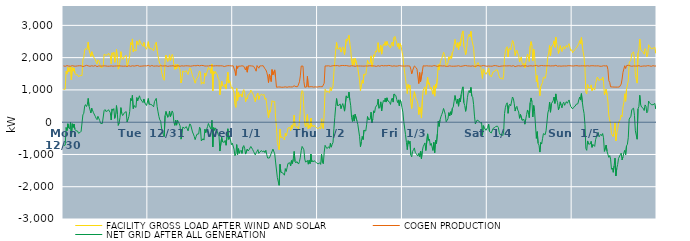
| Category | FACILITY GROSS LOAD AFTER WIND AND SOLAR | COGEN PRODUCTION | NET GRID AFTER ALL GENERATION |
|---|---|---|---|
|  Mon  12/30 | 1017 | 1745 | -728 |
|  Mon  12/30 | 1010 | 1744 | -734 |
|  Mon  12/30 | 1022 | 1731 | -709 |
|  Mon  12/30 | 1578 | 1745 | -167 |
|  Mon  12/30 | 1491 | 1753 | -262 |
|  Mon  12/30 | 1694 | 1743 | -49 |
|  Mon  12/30 | 1563 | 1738 | -175 |
|  Mon  12/30 | 1541 | 1749 | -208 |
|  Mon  12/30 | 1733 | 1734 | -1 |
|  Mon  12/30 | 1307 | 1746 | -439 |
|  Mon  12/30 | 1703 | 1751 | -48 |
|  Mon  12/30 | 1582 | 1745 | -163 |
|  Mon  12/30 | 1681 | 1737 | -56 |
|  Mon  12/30 | 1521 | 1743 | -222 |
|  Mon  12/30 | 1472 | 1736 | -264 |
|  Mon  12/30 | 1482 | 1726 | -244 |
|  Mon  12/30 | 1469 | 1744 | -275 |
|  Mon  12/30 | 1414 | 1756 | -342 |
|  Mon  12/30 | 1415 | 1749 | -334 |
|  Mon  12/30 | 1444 | 1758 | -314 |
|  Mon  12/30 | 1466 | 1748 | -282 |
|  Mon  12/30 | 1446 | 1740 | -294 |
|  Mon  12/30 | 1948 | 1723 | 225 |
|  Mon  12/30 | 2003 | 1727 | 276 |
|  Mon  12/30 | 2238 | 1740 | 498 |
|  Mon  12/30 | 2282 | 1738 | 544 |
|  Mon  12/30 | 2246 | 1762 | 484 |
|  Mon  12/30 | 2295 | 1756 | 539 |
|  Mon  12/30 | 2481 | 1745 | 736 |
|  Mon  12/30 | 2234 | 1740 | 494 |
|  Mon  12/30 | 2254 | 1732 | 522 |
|  Mon  12/30 | 2035 | 1748 | 287 |
|  Mon  12/30 | 2183 | 1748 | 435 |
|  Mon  12/30 | 2174 | 1753 | 421 |
|  Mon  12/30 | 2026 | 1735 | 291 |
|  Mon  12/30 | 1996 | 1733 | 263 |
|  Mon  12/30 | 1937 | 1755 | 182 |
|  Mon  12/30 | 1860 | 1740 | 120 |
|  Mon  12/30 | 1799 | 1721 | 78 |
|  Mon  12/30 | 1933 | 1750 | 183 |
|  Mon  12/30 | 1902 | 1744 | 158 |
|  Mon  12/30 | 1816 | 1764 | 52 |
|  Mon  12/30 | 1703 | 1738 | -35 |
|  Mon  12/30 | 1677 | 1732 | -55 |
|  Mon  12/30 | 1699 | 1740 | -41 |
|  Mon  12/30 | 1731 | 1745 | -14 |
|  Mon  12/30 | 2104 | 1745 | 359 |
|  Mon  12/30 | 2131 | 1740 | 391 |
|  Mon  12/30 | 2075 | 1742 | 333 |
|  Mon  12/30 | 2072 | 1755 | 317 |
|  Mon  12/30 | 2084 | 1734 | 350 |
|  Mon  12/30 | 2137 | 1750 | 387 |
|  Mon  12/30 | 2111 | 1735 | 376 |
|  Mon  12/30 | 2050 | 1754 | 296 |
|  Mon  12/30 | 1811 | 1744 | 67 |
|  Mon  12/30 | 2151 | 1740 | 411 |
|  Mon  12/30 | 2099 | 1735 | 364 |
|  Mon  12/30 | 2167 | 1746 | 421 |
|  Mon  12/30 | 1857 | 1740 | 117 |
|  Mon  12/30 | 1969 | 1754 | 215 |
|  Mon  12/30 | 2256 | 1741 | 515 |
|  Mon  12/30 | 1997 | 1745 | 252 |
|  Mon  12/30 | 1644 | 1743 | -99 |
|  Mon  12/30 | 1717 | 1741 | -24 |
|  Mon  12/30 | 1888 | 1744 | 144 |
|  Mon  12/30 | 2185 | 1734 | 451 |
|  Mon  12/30 | 2007 | 1738 | 269 |
|  Mon  12/30 | 1948 | 1743 | 205 |
|  Mon  12/30 | 1943 | 1735 | 208 |
|  Mon  12/30 | 2030 | 1736 | 294 |
|  Mon  12/30 | 2027 | 1740 | 287 |
|  Mon  12/30 | 2069 | 1742 | 327 |
|  Mon  12/30 | 1733 | 1727 | 6 |
|  Mon  12/30 | 1825 | 1736 | 89 |
|  Mon  12/30 | 1926 | 1750 | 176 |
|  Mon  12/30 | 2067 | 1730 | 337 |
|  Mon  12/30 | 2465 | 1731 | 734 |
|  Mon  12/30 | 2402 | 1729 | 673 |
|  Mon  12/30 | 2581 | 1748 | 833 |
|  Mon  12/30 | 2177 | 1755 | 422 |
|  Mon  12/30 | 2247 | 1737 | 510 |
|  Mon  12/30 | 2242 | 1752 | 490 |
|  Mon  12/30 | 2204 | 1748 | 456 |
|  Mon  12/30 | 2517 | 1754 | 763 |
|  Mon  12/30 | 2419 | 1757 | 662 |
|  Mon  12/30 | 2387 | 1738 | 649 |
|  Mon  12/30 | 2551 | 1733 | 818 |
|  Mon  12/30 | 2479 | 1752 | 727 |
|  Mon  12/30 | 2492 | 1736 | 756 |
|  Mon  12/30 | 2391 | 1743 | 648 |
|  Mon  12/30 | 2348 | 1741 | 607 |
|  Mon  12/30 | 2470 | 1751 | 719 |
|  Mon  12/30 | 2346 | 1746 | 600 |
|  Mon  12/30 | 2325 | 1733 | 592 |
|  Mon  12/30 | 2261 | 1744 | 517 |
|  Mon  12/30 | 2242 | 1743 | 499 |
|  Tue  12/31 | 2494 | 1761 | 733 |
|  Tue  12/31 | 2291 | 1738 | 553 |
|  Tue  12/31 | 2299 | 1732 | 567 |
|  Tue  12/31 | 2287 | 1734 | 553 |
|  Tue  12/31 | 2282 | 1757 | 525 |
|  Tue  12/31 | 2243 | 1731 | 512 |
|  Tue  12/31 | 2212 | 1736 | 476 |
|  Tue  12/31 | 2352 | 1716 | 636 |
|  Tue  12/31 | 2354 | 1740 | 614 |
|  Tue  12/31 | 2477 | 1739 | 738 |
|  Tue  12/31 | 2229 | 1744 | 485 |
|  Tue  12/31 | 2066 | 1744 | 322 |
|  Tue  12/31 | 1908 | 1732 | 176 |
|  Tue  12/31 | 1812 | 1740 | 72 |
|  Tue  12/31 | 1781 | 1750 | 31 |
|  Tue  12/31 | 1557 | 1739 | -182 |
|  Tue  12/31 | 1571 | 1741 | -170 |
|  Tue  12/31 | 1347 | 1729 | -382 |
|  Tue  12/31 | 1298 | 1743 | -445 |
|  Tue  12/31 | 1941 | 1736 | 205 |
|  Tue  12/31 | 2080 | 1747 | 333 |
|  Tue  12/31 | 2085 | 1735 | 350 |
|  Tue  12/31 | 1880 | 1729 | 151 |
|  Tue  12/31 | 1919 | 1733 | 186 |
|  Tue  12/31 | 2085 | 1740 | 345 |
|  Tue  12/31 | 1908 | 1735 | 173 |
|  Tue  12/31 | 1994 | 1743 | 251 |
|  Tue  12/31 | 2102 | 1754 | 348 |
|  Tue  12/31 | 2032 | 1748 | 284 |
|  Tue  12/31 | 1746 | 1751 | -5 |
|  Tue  12/31 | 1633 | 1733 | -100 |
|  Tue  12/31 | 1787 | 1729 | 58 |
|  Tue  12/31 | 1649 | 1741 | -92 |
|  Tue  12/31 | 1799 | 1738 | 61 |
|  Tue  12/31 | 1764 | 1747 | 17 |
|  Tue  12/31 | 1793 | 1747 | 46 |
|  Tue  12/31 | 1614 | 1734 | -120 |
|  Tue  12/31 | 1215 | 1740 | -525 |
|  Tue  12/31 | 1330 | 1747 | -417 |
|  Tue  12/31 | 1586 | 1739 | -153 |
|  Tue  12/31 | 1614 | 1738 | -124 |
|  Tue  12/31 | 1557 | 1745 | -188 |
|  Tue  12/31 | 1575 | 1747 | -172 |
|  Tue  12/31 | 1599 | 1737 | -138 |
|  Tue  12/31 | 1597 | 1747 | -150 |
|  Tue  12/31 | 1475 | 1745 | -270 |
|  Tue  12/31 | 1594 | 1742 | -148 |
|  Tue  12/31 | 1682 | 1734 | -52 |
|  Tue  12/31 | 1646 | 1735 | -89 |
|  Tue  12/31 | 1649 | 1741 | -92 |
|  Tue  12/31 | 1441 | 1745 | -304 |
|  Tue  12/31 | 1377 | 1746 | -369 |
|  Tue  12/31 | 1310 | 1752 | -442 |
|  Tue  12/31 | 1207 | 1749 | -542 |
|  Tue  12/31 | 1296 | 1747 | -451 |
|  Tue  12/31 | 1369 | 1743 | -374 |
|  Tue  12/31 | 1400 | 1761 | -361 |
|  Tue  12/31 | 1375 | 1739 | -364 |
|  Tue  12/31 | 1589 | 1745 | -156 |
|  Tue  12/31 | 1551 | 1744 | -193 |
|  Tue  12/31 | 1177 | 1759 | -582 |
|  Tue  12/31 | 1151 | 1735 | -584 |
|  Tue  12/31 | 1244 | 1755 | -511 |
|  Tue  12/31 | 1189 | 1744 | -555 |
|  Tue  12/31 | 1523 | 1739 | -216 |
|  Tue  12/31 | 1427 | 1751 | -324 |
|  Tue  12/31 | 1516 | 1741 | -225 |
|  Tue  12/31 | 1610 | 1749 | -139 |
|  Tue  12/31 | 1701 | 1741 | -40 |
|  Tue  12/31 | 1636 | 1748 | -112 |
|  Tue  12/31 | 1667 | 1753 | -86 |
|  Tue  12/31 | 1514 | 1732 | -218 |
|  Tue  12/31 | 1804 | 1746 | 58 |
|  Tue  12/31 | 972 | 1741 | -769 |
|  Tue  12/31 | 1573 | 1742 | -169 |
|  Tue  12/31 | 1497 | 1750 | -253 |
|  Tue  12/31 | 1570 | 1747 | -177 |
|  Tue  12/31 | 1508 | 1736 | -228 |
|  Tue  12/31 | 1470 | 1749 | -279 |
|  Tue  12/31 | 1361 | 1739 | -378 |
|  Tue  12/31 | 1315 | 1744 | -429 |
|  Tue  12/31 | 845 | 1739 | -894 |
|  Tue  12/31 | 837 | 1748 | -911 |
|  Tue  12/31 | 1275 | 1744 | -469 |
|  Tue  12/31 | 1133 | 1743 | -610 |
|  Tue  12/31 | 1144 | 1735 | -591 |
|  Tue  12/31 | 1100 | 1724 | -624 |
|  Tue  12/31 | 1178 | 1742 | -564 |
|  Tue  12/31 | 1026 | 1741 | -715 |
|  Tue  12/31 | 997 | 1735 | -738 |
|  Tue  12/31 | 1546 | 1751 | -205 |
|  Tue  12/31 | 1212 | 1746 | -534 |
|  Tue  12/31 | 1295 | 1750 | -455 |
|  Tue  12/31 | 1195 | 1742 | -547 |
|  Tue  12/31 | 1047 | 1744 | -697 |
|  Tue  12/31 | 1083 | 1732 | -649 |
|  Wed  1/1 | 1073 | 1746 | -673 |
|  Wed  1/1 | 911 | 1746 | -835 |
|  Wed  1/1 | 541 | 1582 | -1041 |
|  Wed  1/1 | 459 | 1446 | -987 |
|  Wed  1/1 | 1051 | 1745 | -694 |
|  Wed  1/1 | 662 | 1666 | -1004 |
|  Wed  1/1 | 917 | 1737 | -820 |
|  Wed  1/1 | 786 | 1750 | -964 |
|  Wed  1/1 | 834 | 1736 | -902 |
|  Wed  1/1 | 877 | 1748 | -871 |
|  Wed  1/1 | 778 | 1747 | -969 |
|  Wed  1/1 | 953 | 1726 | -773 |
|  Wed  1/1 | 1011 | 1735 | -724 |
|  Wed  1/1 | 930 | 1735 | -805 |
|  Wed  1/1 | 629 | 1617 | -988 |
|  Wed  1/1 | 753 | 1719 | -966 |
|  Wed  1/1 | 716 | 1550 | -834 |
|  Wed  1/1 | 855 | 1745 | -890 |
|  Wed  1/1 | 885 | 1741 | -856 |
|  Wed  1/1 | 891 | 1747 | -856 |
|  Wed  1/1 | 996 | 1750 | -754 |
|  Wed  1/1 | 943 | 1742 | -799 |
|  Wed  1/1 | 897 | 1741 | -844 |
|  Wed  1/1 | 832 | 1735 | -903 |
|  Wed  1/1 | 812 | 1728 | -916 |
|  Wed  1/1 | 634 | 1646 | -1012 |
|  Wed  1/1 | 631 | 1580 | -949 |
|  Wed  1/1 | 855 | 1755 | -900 |
|  Wed  1/1 | 904 | 1754 | -850 |
|  Wed  1/1 | 705 | 1672 | -967 |
|  Wed  1/1 | 813 | 1741 | -928 |
|  Wed  1/1 | 818 | 1751 | -933 |
|  Wed  1/1 | 867 | 1746 | -879 |
|  Wed  1/1 | 835 | 1751 | -916 |
|  Wed  1/1 | 807 | 1749 | -942 |
|  Wed  1/1 | 857 | 1749 | -892 |
|  Wed  1/1 | 707 | 1653 | -946 |
|  Wed  1/1 | 750 | 1620 | -870 |
|  Wed  1/1 | 546 | 1551 | -1005 |
|  Wed  1/1 | 318 | 1429 | -1111 |
|  Wed  1/1 | 132 | 1228 | -1096 |
|  Wed  1/1 | 375 | 1485 | -1110 |
|  Wed  1/1 | 309 | 1391 | -1082 |
|  Wed  1/1 | 284 | 1258 | -974 |
|  Wed  1/1 | 668 | 1629 | -961 |
|  Wed  1/1 | 634 | 1467 | -833 |
|  Wed  1/1 | 638 | 1470 | -832 |
|  Wed  1/1 | 641 | 1620 | -979 |
|  Wed  1/1 | 145 | 1380 | -1235 |
|  Wed  1/1 | -158 | 1083 | -1241 |
|  Wed  1/1 | -631 | 1086 | -1717 |
|  Wed  1/1 | -629 | 1091 | -1720 |
|  Wed  1/1 | -853 | 1103 | -1956 |
|  Wed  1/1 | -214 | 1091 | -1305 |
|  Wed  1/1 | -471 | 1079 | -1550 |
|  Wed  1/1 | -458 | 1081 | -1539 |
|  Wed  1/1 | -468 | 1102 | -1570 |
|  Wed  1/1 | -504 | 1084 | -1588 |
|  Wed  1/1 | -550 | 1093 | -1643 |
|  Wed  1/1 | -345 | 1096 | -1441 |
|  Wed  1/1 | -427 | 1097 | -1524 |
|  Wed  1/1 | -331 | 1081 | -1412 |
|  Wed  1/1 | -180 | 1099 | -1279 |
|  Wed  1/1 | -176 | 1096 | -1272 |
|  Wed  1/1 | -162 | 1095 | -1257 |
|  Wed  1/1 | -263 | 1092 | -1355 |
|  Wed  1/1 | -92 | 1099 | -1191 |
|  Wed  1/1 | -188 | 1092 | -1280 |
|  Wed  1/1 | -49 | 1097 | -1146 |
|  Wed  1/1 | 222 | 1128 | -906 |
|  Wed  1/1 | -124 | 1098 | -1222 |
|  Wed  1/1 | -163 | 1100 | -1263 |
|  Wed  1/1 | -127 | 1093 | -1220 |
|  Wed  1/1 | -107 | 1102 | -1209 |
|  Wed  1/1 | -211 | 1086 | -1297 |
|  Wed  1/1 | 30 | 1252 | -1222 |
|  Wed  1/1 | 350 | 1434 | -1084 |
|  Wed  1/1 | 856 | 1739 | -883 |
|  Wed  1/1 | 979 | 1731 | -752 |
|  Wed  1/1 | 938 | 1737 | -799 |
|  Wed  1/1 | 413 | 1267 | -854 |
|  Wed  1/1 | -62 | 1082 | -1144 |
|  Wed  1/1 | -150 | 1090 | -1240 |
|  Wed  1/1 | -160 | 1092 | -1252 |
|  Wed  1/1 | 235 | 1419 | -1184 |
|  Wed  1/1 | -212 | 1090 | -1302 |
|  Wed  1/1 | -94 | 1085 | -1179 |
|  Wed  1/1 | -185 | 1098 | -1283 |
|  Wed  1/1 | 128 | 1119 | -991 |
|  Wed  1/1 | -134 | 1100 | -1234 |
|  Wed  1/1 | -98 | 1095 | -1193 |
|  Wed  1/1 | -143 | 1087 | -1230 |
|  Wed  1/1 | -97 | 1095 | -1192 |
|  Wed  1/1 | -131 | 1095 | -1226 |
|  Wed  1/1 | -158 | 1087 | -1245 |
|  Wed  1/1 | -194 | 1087 | -1281 |
|  Thu  1/2 | -218 | 1081 | -1299 |
|  Thu  1/2 | -187 | 1099 | -1286 |
|  Thu  1/2 | -154 | 1100 | -1254 |
|  Thu  1/2 | -209 | 1099 | -1308 |
|  Thu  1/2 | 105 | 1098 | -993 |
|  Thu  1/2 | -155 | 1098 | -1253 |
|  Thu  1/2 | -202 | 1088 | -1290 |
|  Thu  1/2 | 278 | 1209 | -931 |
|  Thu  1/2 | 1026 | 1743 | -717 |
|  Thu  1/2 | 1014 | 1755 | -741 |
|  Thu  1/2 | 926 | 1743 | -817 |
|  Thu  1/2 | 960 | 1747 | -787 |
|  Thu  1/2 | 981 | 1747 | -766 |
|  Thu  1/2 | 912 | 1723 | -811 |
|  Thu  1/2 | 1079 | 1732 | -653 |
|  Thu  1/2 | 974 | 1748 | -774 |
|  Thu  1/2 | 1055 | 1745 | -690 |
|  Thu  1/2 | 1114 | 1738 | -624 |
|  Thu  1/2 | 1561 | 1752 | -191 |
|  Thu  1/2 | 1887 | 1734 | 153 |
|  Thu  1/2 | 2235 | 1751 | 484 |
|  Thu  1/2 | 2472 | 1740 | 732 |
|  Thu  1/2 | 2271 | 1754 | 517 |
|  Thu  1/2 | 2259 | 1734 | 525 |
|  Thu  1/2 | 2265 | 1738 | 527 |
|  Thu  1/2 | 2323 | 1756 | 567 |
|  Thu  1/2 | 2172 | 1752 | 420 |
|  Thu  1/2 | 2254 | 1743 | 511 |
|  Thu  1/2 | 2333 | 1757 | 576 |
|  Thu  1/2 | 2219 | 1747 | 472 |
|  Thu  1/2 | 2094 | 1752 | 342 |
|  Thu  1/2 | 2106 | 1736 | 370 |
|  Thu  1/2 | 2571 | 1755 | 816 |
|  Thu  1/2 | 2508 | 1728 | 780 |
|  Thu  1/2 | 2491 | 1743 | 748 |
|  Thu  1/2 | 2691 | 1759 | 932 |
|  Thu  1/2 | 2426 | 1736 | 690 |
|  Thu  1/2 | 2250 | 1741 | 509 |
|  Thu  1/2 | 1889 | 1749 | 140 |
|  Thu  1/2 | 1757 | 1734 | 23 |
|  Thu  1/2 | 1966 | 1742 | 224 |
|  Thu  1/2 | 1767 | 1734 | 33 |
|  Thu  1/2 | 1976 | 1731 | 245 |
|  Thu  1/2 | 1987 | 1761 | 226 |
|  Thu  1/2 | 1787 | 1745 | 42 |
|  Thu  1/2 | 1681 | 1747 | -66 |
|  Thu  1/2 | 1691 | 1741 | -50 |
|  Thu  1/2 | 1300 | 1737 | -437 |
|  Thu  1/2 | 977 | 1741 | -764 |
|  Thu  1/2 | 1154 | 1759 | -605 |
|  Thu  1/2 | 1296 | 1739 | -443 |
|  Thu  1/2 | 1205 | 1742 | -537 |
|  Thu  1/2 | 1490 | 1737 | -247 |
|  Thu  1/2 | 1473 | 1746 | -273 |
|  Thu  1/2 | 1468 | 1742 | -274 |
|  Thu  1/2 | 1669 | 1750 | -81 |
|  Thu  1/2 | 1914 | 1740 | 174 |
|  Thu  1/2 | 1824 | 1741 | 83 |
|  Thu  1/2 | 1834 | 1747 | 87 |
|  Thu  1/2 | 1820 | 1730 | 90 |
|  Thu  1/2 | 2056 | 1747 | 309 |
|  Thu  1/2 | 1711 | 1735 | -24 |
|  Thu  1/2 | 1843 | 1744 | 99 |
|  Thu  1/2 | 2090 | 1736 | 354 |
|  Thu  1/2 | 2035 | 1741 | 294 |
|  Thu  1/2 | 2209 | 1745 | 464 |
|  Thu  1/2 | 2171 | 1728 | 443 |
|  Thu  1/2 | 2279 | 1740 | 539 |
|  Thu  1/2 | 2464 | 1751 | 713 |
|  Thu  1/2 | 2167 | 1737 | 430 |
|  Thu  1/2 | 2198 | 1733 | 465 |
|  Thu  1/2 | 2382 | 1752 | 630 |
|  Thu  1/2 | 2108 | 1758 | 350 |
|  Thu  1/2 | 2308 | 1749 | 559 |
|  Thu  1/2 | 2417 | 1745 | 672 |
|  Thu  1/2 | 2385 | 1752 | 633 |
|  Thu  1/2 | 2494 | 1751 | 743 |
|  Thu  1/2 | 2375 | 1752 | 623 |
|  Thu  1/2 | 2501 | 1746 | 755 |
|  Thu  1/2 | 2405 | 1745 | 660 |
|  Thu  1/2 | 2429 | 1759 | 670 |
|  Thu  1/2 | 2359 | 1737 | 622 |
|  Thu  1/2 | 2300 | 1750 | 550 |
|  Thu  1/2 | 2432 | 1745 | 687 |
|  Thu  1/2 | 2483 | 1735 | 748 |
|  Thu  1/2 | 2354 | 1732 | 622 |
|  Thu  1/2 | 2620 | 1746 | 874 |
|  Thu  1/2 | 2659 | 1756 | 903 |
|  Thu  1/2 | 2563 | 1736 | 827 |
|  Thu  1/2 | 2458 | 1750 | 708 |
|  Thu  1/2 | 2347 | 1740 | 607 |
|  Thu  1/2 | 2447 | 1756 | 691 |
|  Thu  1/2 | 2264 | 1753 | 511 |
|  Thu  1/2 | 2433 | 1742 | 691 |
|  Thu  1/2 | 2354 | 1743 | 611 |
|  Thu  1/2 | 2189 | 1740 | 449 |
|  Fri  1/3 | 2052 | 1740 | 312 |
|  Fri  1/3 | 1753 | 1729 | 24 |
|  Fri  1/3 | 1740 | 1738 | 2 |
|  Fri  1/3 | 1344 | 1730 | -386 |
|  Fri  1/3 | 1121 | 1743 | -622 |
|  Fri  1/3 | 887 | 1738 | -851 |
|  Fri  1/3 | 1170 | 1744 | -574 |
|  Fri  1/3 | 1064 | 1735 | -671 |
|  Fri  1/3 | 1148 | 1737 | -589 |
|  Fri  1/3 | 630 | 1643 | -1013 |
|  Fri  1/3 | 425 | 1501 | -1076 |
|  Fri  1/3 | 698 | 1602 | -904 |
|  Fri  1/3 | 750 | 1602 | -852 |
|  Fri  1/3 | 945 | 1742 | -797 |
|  Fri  1/3 | 808 | 1741 | -933 |
|  Fri  1/3 | 717 | 1689 | -972 |
|  Fri  1/3 | 667 | 1641 | -974 |
|  Fri  1/3 | 572 | 1623 | -1051 |
|  Fri  1/3 | 235 | 1198 | -963 |
|  Fri  1/3 | 464 | 1537 | -1073 |
|  Fri  1/3 | 359 | 1258 | -899 |
|  Fri  1/3 | 128 | 1261 | -1133 |
|  Fri  1/3 | 682 | 1570 | -888 |
|  Fri  1/3 | 989 | 1748 | -759 |
|  Fri  1/3 | 1004 | 1746 | -742 |
|  Fri  1/3 | 1098 | 1740 | -642 |
|  Fri  1/3 | 857 | 1736 | -879 |
|  Fri  1/3 | 868 | 1748 | -880 |
|  Fri  1/3 | 1387 | 1749 | -362 |
|  Fri  1/3 | 1176 | 1740 | -564 |
|  Fri  1/3 | 1221 | 1742 | -521 |
|  Fri  1/3 | 1023 | 1741 | -718 |
|  Fri  1/3 | 1079 | 1733 | -654 |
|  Fri  1/3 | 967 | 1734 | -767 |
|  Fri  1/3 | 866 | 1742 | -876 |
|  Fri  1/3 | 1126 | 1753 | -627 |
|  Fri  1/3 | 806 | 1751 | -945 |
|  Fri  1/3 | 1182 | 1746 | -564 |
|  Fri  1/3 | 1074 | 1736 | -662 |
|  Fri  1/3 | 1361 | 1728 | -367 |
|  Fri  1/3 | 1785 | 1752 | 33 |
|  Fri  1/3 | 1614 | 1746 | -132 |
|  Fri  1/3 | 1810 | 1741 | 69 |
|  Fri  1/3 | 1912 | 1746 | 166 |
|  Fri  1/3 | 1974 | 1735 | 239 |
|  Fri  1/3 | 2055 | 1741 | 314 |
|  Fri  1/3 | 2167 | 1742 | 425 |
|  Fri  1/3 | 2089 | 1746 | 343 |
|  Fri  1/3 | 1971 | 1737 | 234 |
|  Fri  1/3 | 1739 | 1729 | 10 |
|  Fri  1/3 | 1723 | 1728 | -5 |
|  Fri  1/3 | 1837 | 1734 | 103 |
|  Fri  1/3 | 2027 | 1731 | 296 |
|  Fri  1/3 | 1944 | 1746 | 198 |
|  Fri  1/3 | 2053 | 1730 | 323 |
|  Fri  1/3 | 1969 | 1735 | 234 |
|  Fri  1/3 | 2164 | 1732 | 432 |
|  Fri  1/3 | 2207 | 1734 | 473 |
|  Fri  1/3 | 2383 | 1733 | 650 |
|  Fri  1/3 | 2562 | 1736 | 826 |
|  Fri  1/3 | 2428 | 1747 | 681 |
|  Fri  1/3 | 2320 | 1739 | 581 |
|  Fri  1/3 | 2460 | 1744 | 716 |
|  Fri  1/3 | 2245 | 1750 | 495 |
|  Fri  1/3 | 2486 | 1746 | 740 |
|  Fri  1/3 | 2359 | 1730 | 629 |
|  Fri  1/3 | 2603 | 1744 | 859 |
|  Fri  1/3 | 2761 | 1736 | 1025 |
|  Fri  1/3 | 2828 | 1733 | 1095 |
|  Fri  1/3 | 2352 | 1748 | 604 |
|  Fri  1/3 | 2253 | 1738 | 515 |
|  Fri  1/3 | 2092 | 1756 | 336 |
|  Fri  1/3 | 2234 | 1729 | 505 |
|  Fri  1/3 | 2502 | 1743 | 759 |
|  Fri  1/3 | 2656 | 1738 | 918 |
|  Fri  1/3 | 2723 | 1741 | 982 |
|  Fri  1/3 | 2646 | 1738 | 908 |
|  Fri  1/3 | 2812 | 1736 | 1076 |
|  Fri  1/3 | 2550 | 1742 | 808 |
|  Fri  1/3 | 2522 | 1745 | 777 |
|  Fri  1/3 | 2308 | 1757 | 551 |
|  Fri  1/3 | 1918 | 1730 | 188 |
|  Fri  1/3 | 1688 | 1745 | -57 |
|  Fri  1/3 | 1684 | 1738 | -54 |
|  Fri  1/3 | 1802 | 1737 | 65 |
|  Fri  1/3 | 1848 | 1756 | 92 |
|  Fri  1/3 | 1779 | 1744 | 35 |
|  Fri  1/3 | 1789 | 1738 | 51 |
|  Fri  1/3 | 1722 | 1754 | -32 |
|  Fri  1/3 | 1746 | 1742 | 4 |
|  Fri  1/3 | 1356 | 1764 | -408 |
|  Fri  1/3 | 1651 | 1757 | -106 |
|  Fri  1/3 | 1578 | 1747 | -169 |
|  Fri  1/3 | 1551 | 1744 | -193 |
|  Fri  1/3 | 1483 | 1734 | -251 |
|  Fri  1/3 | 1472 | 1733 | -261 |
|  Sat  1/4 | 1586 | 1746 | -160 |
|  Sat  1/4 | 1682 | 1740 | -58 |
|  Sat  1/4 | 1465 | 1755 | -290 |
|  Sat  1/4 | 1469 | 1736 | -267 |
|  Sat  1/4 | 1405 | 1740 | -335 |
|  Sat  1/4 | 1387 | 1734 | -347 |
|  Sat  1/4 | 1558 | 1752 | -194 |
|  Sat  1/4 | 1555 | 1752 | -197 |
|  Sat  1/4 | 1576 | 1740 | -164 |
|  Sat  1/4 | 1619 | 1752 | -133 |
|  Sat  1/4 | 1612 | 1735 | -123 |
|  Sat  1/4 | 1617 | 1740 | -123 |
|  Sat  1/4 | 1595 | 1758 | -163 |
|  Sat  1/4 | 1409 | 1727 | -318 |
|  Sat  1/4 | 1355 | 1740 | -385 |
|  Sat  1/4 | 1379 | 1737 | -358 |
|  Sat  1/4 | 1366 | 1743 | -377 |
|  Sat  1/4 | 1327 | 1742 | -415 |
|  Sat  1/4 | 1435 | 1742 | -307 |
|  Sat  1/4 | 2010 | 1746 | 264 |
|  Sat  1/4 | 2204 | 1743 | 461 |
|  Sat  1/4 | 2294 | 1743 | 551 |
|  Sat  1/4 | 2338 | 1737 | 601 |
|  Sat  1/4 | 2019 | 1745 | 274 |
|  Sat  1/4 | 2263 | 1749 | 514 |
|  Sat  1/4 | 2303 | 1748 | 555 |
|  Sat  1/4 | 2243 | 1737 | 506 |
|  Sat  1/4 | 2263 | 1736 | 527 |
|  Sat  1/4 | 2531 | 1751 | 780 |
|  Sat  1/4 | 2487 | 1752 | 735 |
|  Sat  1/4 | 2320 | 1750 | 570 |
|  Sat  1/4 | 2066 | 1721 | 345 |
|  Sat  1/4 | 2185 | 1732 | 453 |
|  Sat  1/4 | 2231 | 1740 | 491 |
|  Sat  1/4 | 2124 | 1749 | 375 |
|  Sat  1/4 | 2066 | 1748 | 318 |
|  Sat  1/4 | 1868 | 1748 | 120 |
|  Sat  1/4 | 1981 | 1738 | 243 |
|  Sat  1/4 | 2024 | 1756 | 268 |
|  Sat  1/4 | 1806 | 1747 | 59 |
|  Sat  1/4 | 1772 | 1725 | 47 |
|  Sat  1/4 | 1825 | 1739 | 86 |
|  Sat  1/4 | 1685 | 1747 | -62 |
|  Sat  1/4 | 1840 | 1750 | 90 |
|  Sat  1/4 | 1988 | 1751 | 237 |
|  Sat  1/4 | 2110 | 1732 | 378 |
|  Sat  1/4 | 2024 | 1729 | 295 |
|  Sat  1/4 | 1883 | 1743 | 140 |
|  Sat  1/4 | 2351 | 1747 | 604 |
|  Sat  1/4 | 2498 | 1747 | 751 |
|  Sat  1/4 | 2377 | 1741 | 636 |
|  Sat  1/4 | 1902 | 1740 | 162 |
|  Sat  1/4 | 2258 | 1742 | 516 |
|  Sat  1/4 | 2083 | 1748 | 335 |
|  Sat  1/4 | 2079 | 1730 | 349 |
|  Sat  1/4 | 1257 | 1759 | -502 |
|  Sat  1/4 | 1444 | 1736 | -292 |
|  Sat  1/4 | 1079 | 1735 | -656 |
|  Sat  1/4 | 1046 | 1757 | -711 |
|  Sat  1/4 | 820 | 1746 | -926 |
|  Sat  1/4 | 1101 | 1730 | -629 |
|  Sat  1/4 | 1079 | 1756 | -677 |
|  Sat  1/4 | 1225 | 1737 | -512 |
|  Sat  1/4 | 1393 | 1748 | -355 |
|  Sat  1/4 | 1378 | 1743 | -365 |
|  Sat  1/4 | 1360 | 1747 | -387 |
|  Sat  1/4 | 1472 | 1736 | -264 |
|  Sat  1/4 | 1745 | 1747 | -2 |
|  Sat  1/4 | 2039 | 1753 | 286 |
|  Sat  1/4 | 2140 | 1749 | 391 |
|  Sat  1/4 | 2375 | 1751 | 624 |
|  Sat  1/4 | 2050 | 1741 | 309 |
|  Sat  1/4 | 2319 | 1747 | 572 |
|  Sat  1/4 | 2290 | 1746 | 544 |
|  Sat  1/4 | 2405 | 1746 | 659 |
|  Sat  1/4 | 2522 | 1743 | 779 |
|  Sat  1/4 | 2321 | 1739 | 582 |
|  Sat  1/4 | 2638 | 1762 | 876 |
|  Sat  1/4 | 2437 | 1745 | 692 |
|  Sat  1/4 | 2348 | 1736 | 612 |
|  Sat  1/4 | 2128 | 1746 | 382 |
|  Sat  1/4 | 2217 | 1742 | 475 |
|  Sat  1/4 | 2371 | 1741 | 630 |
|  Sat  1/4 | 2262 | 1736 | 526 |
|  Sat  1/4 | 2186 | 1743 | 443 |
|  Sat  1/4 | 2314 | 1741 | 573 |
|  Sat  1/4 | 2348 | 1730 | 618 |
|  Sat  1/4 | 2265 | 1743 | 522 |
|  Sat  1/4 | 2325 | 1741 | 584 |
|  Sat  1/4 | 2375 | 1740 | 635 |
|  Sat  1/4 | 2320 | 1735 | 585 |
|  Sat  1/4 | 2387 | 1751 | 636 |
|  Sat  1/4 | 2434 | 1745 | 689 |
|  Sat  1/4 | 2316 | 1749 | 567 |
|  Sat  1/4 | 2214 | 1732 | 482 |
|  Sat  1/4 | 2248 | 1743 | 505 |
|  Sun  1/5 | 2151 | 1740 | 411 |
|  Sun  1/5 | 2197 | 1740 | 457 |
|  Sun  1/5 | 2182 | 1752 | 430 |
|  Sun  1/5 | 2249 | 1750 | 499 |
|  Sun  1/5 | 2296 | 1743 | 553 |
|  Sun  1/5 | 2329 | 1751 | 578 |
|  Sun  1/5 | 2312 | 1741 | 571 |
|  Sun  1/5 | 2430 | 1741 | 689 |
|  Sun  1/5 | 2527 | 1749 | 778 |
|  Sun  1/5 | 2428 | 1743 | 685 |
|  Sun  1/5 | 2622 | 1738 | 884 |
|  Sun  1/5 | 2371 | 1746 | 625 |
|  Sun  1/5 | 2171 | 1754 | 417 |
|  Sun  1/5 | 2016 | 1744 | 272 |
|  Sun  1/5 | 1666 | 1741 | -75 |
|  Sun  1/5 | 925 | 1741 | -816 |
|  Sun  1/5 | 876 | 1748 | -872 |
|  Sun  1/5 | 1168 | 1749 | -581 |
|  Sun  1/5 | 1067 | 1745 | -678 |
|  Sun  1/5 | 1040 | 1739 | -699 |
|  Sun  1/5 | 1064 | 1741 | -677 |
|  Sun  1/5 | 1155 | 1749 | -594 |
|  Sun  1/5 | 977 | 1756 | -779 |
|  Sun  1/5 | 1057 | 1749 | -692 |
|  Sun  1/5 | 1061 | 1743 | -682 |
|  Sun  1/5 | 994 | 1744 | -750 |
|  Sun  1/5 | 1201 | 1744 | -543 |
|  Sun  1/5 | 1211 | 1744 | -533 |
|  Sun  1/5 | 1399 | 1757 | -358 |
|  Sun  1/5 | 1427 | 1746 | -319 |
|  Sun  1/5 | 1288 | 1743 | -455 |
|  Sun  1/5 | 1325 | 1733 | -408 |
|  Sun  1/5 | 1352 | 1727 | -375 |
|  Sun  1/5 | 1313 | 1733 | -420 |
|  Sun  1/5 | 1397 | 1749 | -352 |
|  Sun  1/5 | 1265 | 1749 | -484 |
|  Sun  1/5 | 846 | 1751 | -905 |
|  Sun  1/5 | 862 | 1743 | -881 |
|  Sun  1/5 | 1024 | 1733 | -709 |
|  Sun  1/5 | 843 | 1748 | -905 |
|  Sun  1/5 | 626 | 1627 | -1001 |
|  Sun  1/5 | 193 | 1283 | -1090 |
|  Sun  1/5 | 198 | 1233 | -1035 |
|  Sun  1/5 | -50 | 1095 | -1145 |
|  Sun  1/5 | -357 | 1102 | -1459 |
|  Sun  1/5 | -330 | 1091 | -1421 |
|  Sun  1/5 | -450 | 1103 | -1553 |
|  Sun  1/5 | -264 | 1088 | -1352 |
|  Sun  1/5 | -20 | 1094 | -1114 |
|  Sun  1/5 | -579 | 1087 | -1666 |
|  Sun  1/5 | -325 | 1102 | -1427 |
|  Sun  1/5 | -222 | 1086 | -1308 |
|  Sun  1/5 | -18 | 1103 | -1121 |
|  Sun  1/5 | -11 | 1092 | -1103 |
|  Sun  1/5 | 94 | 1101 | -1007 |
|  Sun  1/5 | 222 | 1180 | -958 |
|  Sun  1/5 | 166 | 1336 | -1170 |
|  Sun  1/5 | 469 | 1545 | -1076 |
|  Sun  1/5 | 611 | 1561 | -950 |
|  Sun  1/5 | 878 | 1750 | -872 |
|  Sun  1/5 | 647 | 1663 | -1016 |
|  Sun  1/5 | 1018 | 1752 | -734 |
|  Sun  1/5 | 1044 | 1729 | -685 |
|  Sun  1/5 | 1281 | 1764 | -483 |
|  Sun  1/5 | 1841 | 1746 | 95 |
|  Sun  1/5 | 1842 | 1744 | 98 |
|  Sun  1/5 | 1939 | 1755 | 184 |
|  Sun  1/5 | 2125 | 1734 | 391 |
|  Sun  1/5 | 2149 | 1735 | 414 |
|  Sun  1/5 | 2176 | 1742 | 434 |
|  Sun  1/5 | 1956 | 1743 | 213 |
|  Sun  1/5 | 1473 | 1739 | -266 |
|  Sun  1/5 | 1496 | 1755 | -259 |
|  Sun  1/5 | 1211 | 1739 | -528 |
|  Sun  1/5 | 2147 | 1737 | 410 |
|  Sun  1/5 | 2234 | 1752 | 482 |
|  Sun  1/5 | 2577 | 1744 | 833 |
|  Sun  1/5 | 2271 | 1729 | 542 |
|  Sun  1/5 | 2211 | 1743 | 468 |
|  Sun  1/5 | 2190 | 1736 | 454 |
|  Sun  1/5 | 2162 | 1735 | 427 |
|  Sun  1/5 | 2104 | 1743 | 361 |
|  Sun  1/5 | 2280 | 1745 | 535 |
|  Sun  1/5 | 2231 | 1737 | 494 |
|  Sun  1/5 | 2023 | 1734 | 289 |
|  Sun  1/5 | 2088 | 1752 | 336 |
|  Sun  1/5 | 2400 | 1746 | 654 |
|  Sun  1/5 | 2348 | 1745 | 603 |
|  Sun  1/5 | 2337 | 1738 | 599 |
|  Sun  1/5 | 2274 | 1731 | 543 |
|  Sun  1/5 | 2291 | 1761 | 530 |
|  Sun  1/5 | 2290 | 1751 | 539 |
|  Sun  1/5 | 2298 | 1746 | 552 |
|  Sun  1/5 | 2320 | 1738 | 582 |
|  Sun  1/5 | 2140 | 1723 | 417 |
|  Sun  1/5 | 2273 | 1743 | 530 |